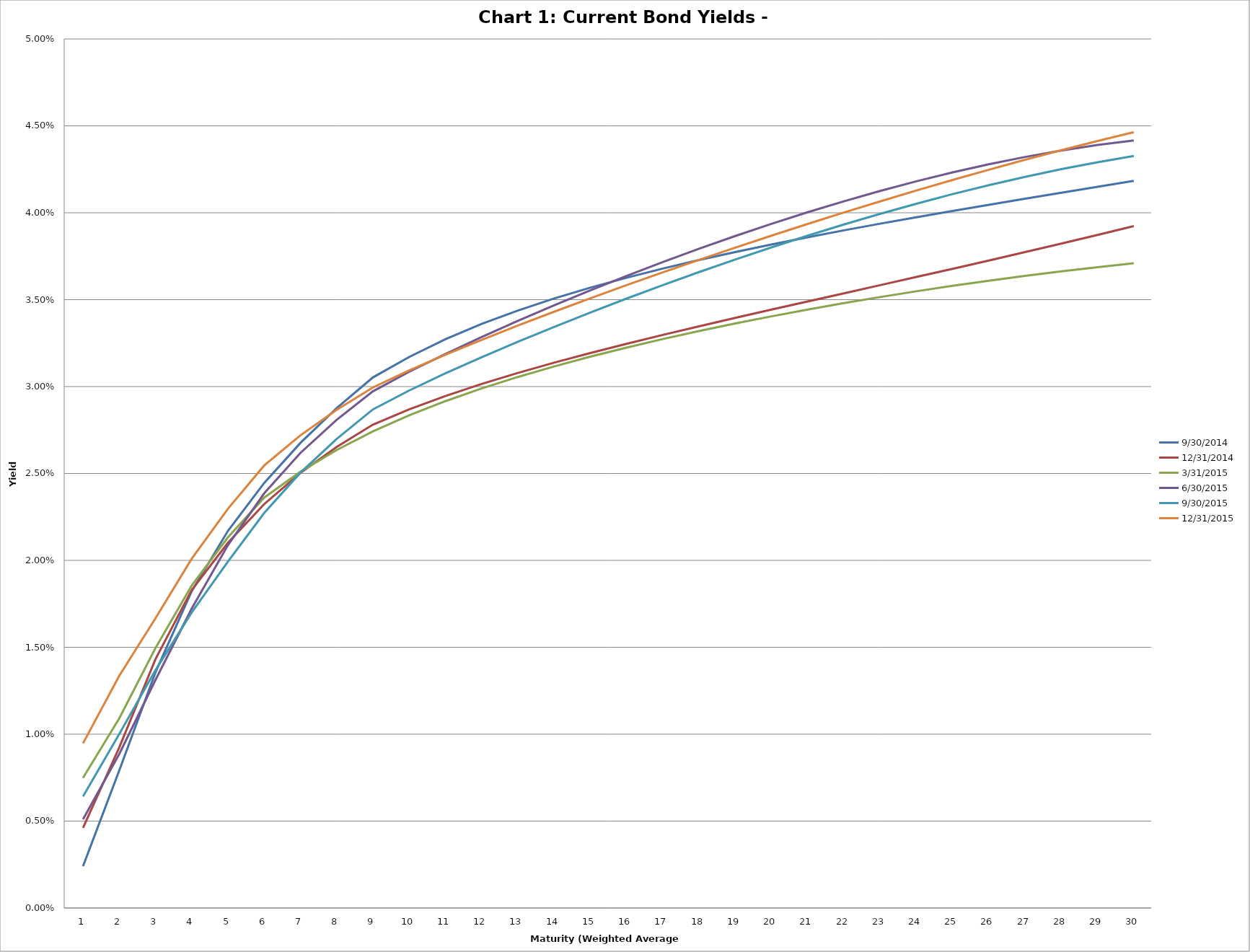
| Category | 9/30/2014 | 12/31/2014 | 3/31/2015 | 6/30/2015 | 9/30/2015 | 12/31/2015 |
|---|---|---|---|---|---|---|
| 0 | 0.002 | 0.005 | 0.007 | 0.005 | 0.006 | 0.009 |
| 1 | 0.008 | 0.009 | 0.011 | 0.009 | 0.01 | 0.013 |
| 2 | 0.014 | 0.014 | 0.015 | 0.013 | 0.014 | 0.017 |
| 3 | 0.018 | 0.018 | 0.019 | 0.017 | 0.017 | 0.02 |
| 4 | 0.022 | 0.021 | 0.021 | 0.021 | 0.02 | 0.023 |
| 5 | 0.024 | 0.023 | 0.024 | 0.024 | 0.023 | 0.025 |
| 6 | 0.027 | 0.025 | 0.025 | 0.026 | 0.025 | 0.027 |
| 7 | 0.029 | 0.027 | 0.026 | 0.028 | 0.027 | 0.029 |
| 8 | 0.031 | 0.028 | 0.027 | 0.03 | 0.029 | 0.03 |
| 9 | 0.032 | 0.029 | 0.028 | 0.031 | 0.03 | 0.031 |
| 10 | 0.033 | 0.029 | 0.029 | 0.032 | 0.031 | 0.032 |
| 11 | 0.034 | 0.03 | 0.03 | 0.033 | 0.032 | 0.033 |
| 12 | 0.034 | 0.031 | 0.031 | 0.034 | 0.033 | 0.034 |
| 13 | 0.035 | 0.031 | 0.031 | 0.035 | 0.033 | 0.034 |
| 14 | 0.036 | 0.032 | 0.032 | 0.036 | 0.034 | 0.035 |
| 15 | 0.036 | 0.032 | 0.032 | 0.036 | 0.035 | 0.036 |
| 16 | 0.037 | 0.033 | 0.033 | 0.037 | 0.036 | 0.037 |
| 17 | 0.037 | 0.033 | 0.033 | 0.038 | 0.037 | 0.037 |
| 18 | 0.038 | 0.034 | 0.034 | 0.039 | 0.037 | 0.038 |
| 19 | 0.038 | 0.034 | 0.034 | 0.039 | 0.038 | 0.039 |
| 20 | 0.039 | 0.035 | 0.034 | 0.04 | 0.039 | 0.039 |
| 21 | 0.039 | 0.035 | 0.035 | 0.041 | 0.039 | 0.04 |
| 22 | 0.039 | 0.036 | 0.035 | 0.041 | 0.04 | 0.041 |
| 23 | 0.04 | 0.036 | 0.035 | 0.042 | 0.041 | 0.041 |
| 24 | 0.04 | 0.037 | 0.036 | 0.042 | 0.041 | 0.042 |
| 25 | 0.04 | 0.037 | 0.036 | 0.043 | 0.042 | 0.042 |
| 26 | 0.041 | 0.038 | 0.036 | 0.043 | 0.042 | 0.043 |
| 27 | 0.041 | 0.038 | 0.037 | 0.044 | 0.043 | 0.044 |
| 28 | 0.041 | 0.039 | 0.037 | 0.044 | 0.043 | 0.044 |
| 29 | 0.042 | 0.039 | 0.037 | 0.044 | 0.043 | 0.045 |